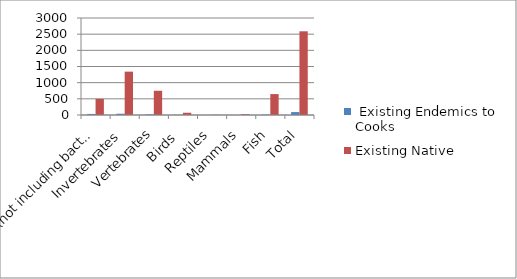
| Category |  Existing Endemics to Cooks | Existing Native  |
|---|---|---|
| Plants (not including bacteria or pathogens) | 33 | 498 |
| Invertebrates | 39 | 1341 |
| Vertebrates | 18 | 750 |
| Birds  | 6 | 70 |
| Reptiles | 0 | 5 |
| Mammals | 0 | 25 |
| Fish | 12 | 647 |
| Total | 90 | 2589 |